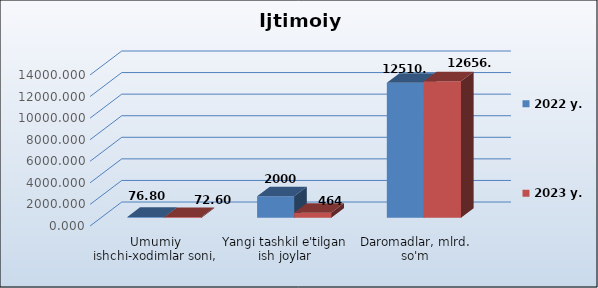
| Category | 2022 y. | 2023 y. |
|---|---|---|
| Umumiy ishchi-xodimlar soni, ming odam | 76.8 | 72.6 |
| Yangi tashkil e'tilgan ish joylar | 2000 | 464 |
| Daromadlar, mlrd. so'm | 12510.5 | 12656.3 |